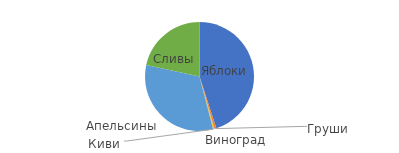
| Category | Количество |
|---|---|
| Яблоки | 2500 |
| Груши | 30 |
| Виноград | 10 |
| Киви | 15 |
| Апельсины | 1800 |
| Сливы | 1200 |